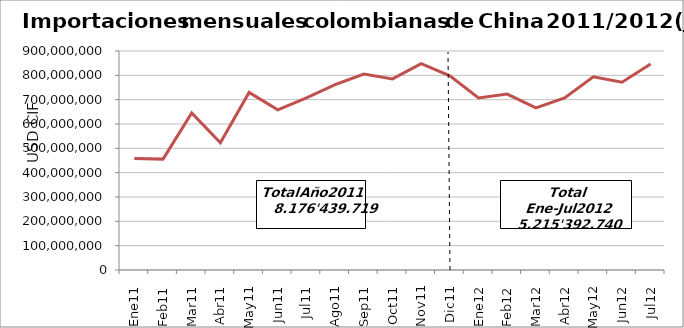
| Category | Series 0 |
|---|---|
| 0 | 458441857.09 |
| 1 | 455703848.81 |
| 2 | 645653411.78 |
| 3 | 522584033.36 |
| 4 | 729676580.68 |
| 5 | 658504857.24 |
| 6 | 707505035.84 |
| 7 | 761582518.99 |
| 8 | 805052807.9 |
| 9 | 785520625.13 |
| 10 | 848251868.9 |
| 11 | 797962272.84 |
| 12 | 706846080.96 |
| 13 | 723036064.51 |
| 14 | 666566048.93 |
| 15 | 707236830.68 |
| 16 | 794020810.3 |
| 17 | 771543689.03 |
| 18 | 846143215.39 |